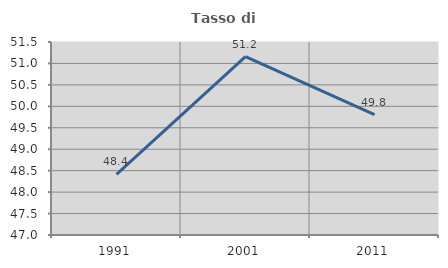
| Category | Tasso di occupazione   |
|---|---|
| 1991.0 | 48.414 |
| 2001.0 | 51.16 |
| 2011.0 | 49.809 |